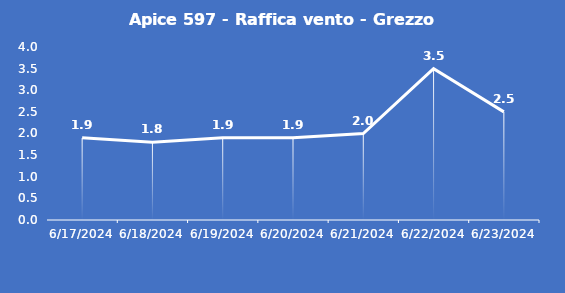
| Category | Apice 597 - Raffica vento - Grezzo (m/s) |
|---|---|
| 6/17/24 | 1.9 |
| 6/18/24 | 1.8 |
| 6/19/24 | 1.9 |
| 6/20/24 | 1.9 |
| 6/21/24 | 2 |
| 6/22/24 | 3.5 |
| 6/23/24 | 2.5 |